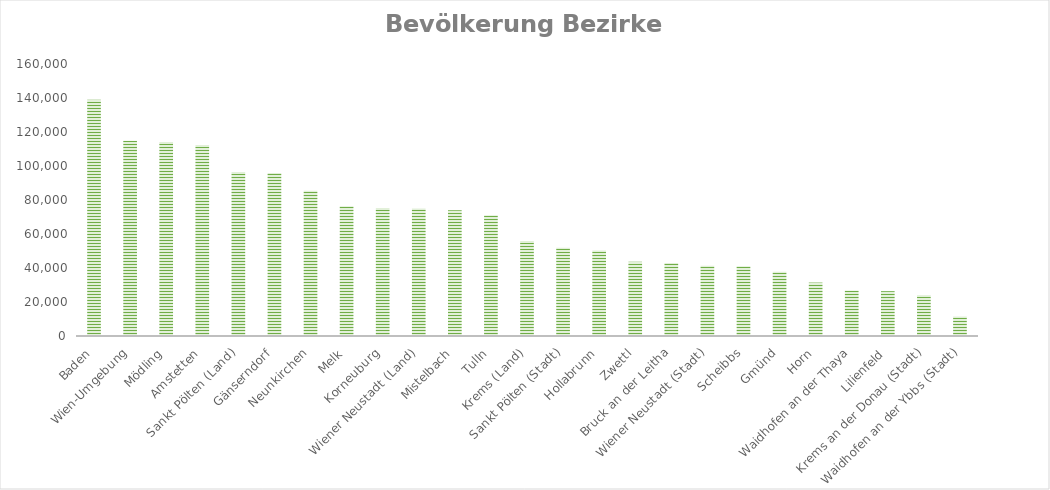
| Category | Series 0 |
|---|---|
| Baden | 139039 |
| Wien-Umgebung | 114920 |
| Mödling | 114086 |
| Amstetten | 112355 |
| Sankt Pölten (Land) | 96522 |
| Gänserndorf | 95841 |
| Neunkirchen | 85460 |
| Melk | 76344 |
| Korneuburg | 75281 |
| Wiener Neustadt (Land) | 75064 |
| Mistelbach | 73962 |
| Tulln | 70963 |
| Krems (Land) | 55874 |
| Sankt Pölten (Stadt) | 51955 |
| Hollabrunn | 50301 |
| Zwettl | 43707 |
| Bruck an der Leitha | 42910 |
| Wiener Neustadt (Stadt) | 41305 |
| Scheibbs | 41020 |
| Gmünd | 37761 |
| Horn | 31429 |
| Waidhofen an der Thaya | 26738 |
| Lilienfeld | 26369 |
| Krems an der Donau (Stadt) | 24032 |
| Waidhofen an der Ybbs (Stadt) | 11455 |